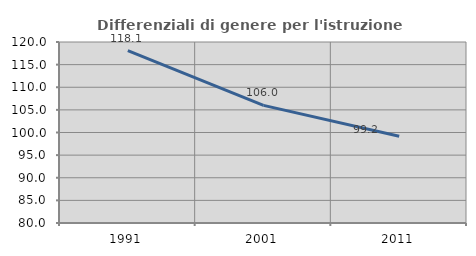
| Category | Differenziali di genere per l'istruzione superiore |
|---|---|
| 1991.0 | 118.071 |
| 2001.0 | 105.998 |
| 2011.0 | 99.156 |